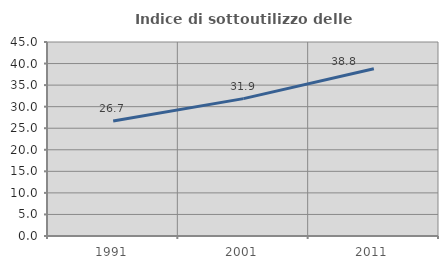
| Category | Indice di sottoutilizzo delle abitazioni  |
|---|---|
| 1991.0 | 26.678 |
| 2001.0 | 31.869 |
| 2011.0 | 38.778 |